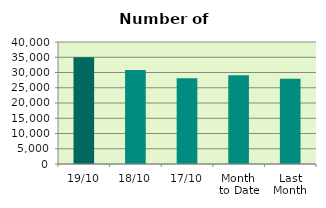
| Category | Series 0 |
|---|---|
| 19/10 | 35014 |
| 18/10 | 30840 |
| 17/10 | 28078 |
| Month 
to Date | 29063.467 |
| Last
Month | 27963.2 |